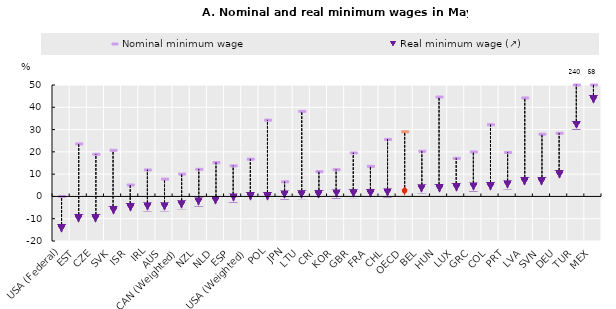
| Category | Nominal minimum wage | Real minimum wage (↗) |
|---|---|---|
| USA (Federal) | 0 | -14.354 |
| EST | 23.563 | -9.893 |
| CZE | 18.9 | -9.858 |
| SVK | 20.702 | -6.215 |
| ISR | 5.117 | -4.971 |
| IRL | 11.881 | -4.666 |
| AUS | 7.762 | -4.644 |
| CAN (Weighted) | 10.021 | -3.715 |
| NZL | 12.169 | -2.473 |
| NLD | 15.141 | -1.648 |
| ESP | 13.708 | -0.689 |
| USA (Weighted) | 16.725 | -0.029 |
| POL | 34.231 | 0.041 |
| JPN | 6.541 | 0.661 |
| LTU | 38.172 | 0.798 |
| CRI | 11.105 | 1.083 |
| KOR | 11.991 | 1.107 |
| GBR | 19.495 | 1.261 |
| FRA | 13.498 | 1.436 |
| CHL | 25.574 | 1.59 |
| OECD | 29.005 | 2.304 |
| BEL | 20.254 | 3.43 |
| HUN | 44.6 | 3.691 |
| LUX | 17.098 | 4.03 |
| GRC | 19.972 | 4.241 |
| COL | 32.148 | 4.506 |
| PRT | 19.685 | 5.211 |
| LVA | 44.186 | 6.844 |
| SVN | 27.938 | 6.882 |
| DEU | 28.342 | 9.945 |
| TUR | 50 | 31.99 |
| MEX | 50 | 43.622 |